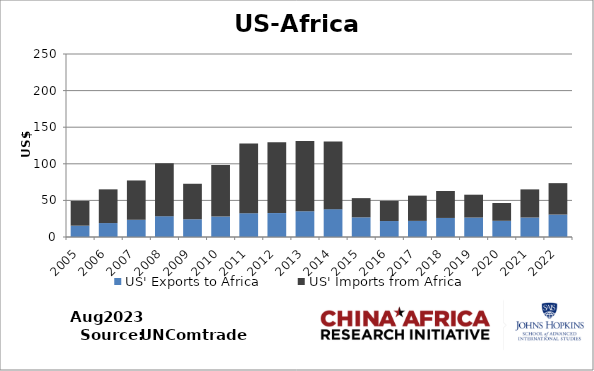
| Category | US' Exports to Africa | US' Imports from Africa |
|---|---|---|
| 2005.0 | 15.479 | 33.751 |
| 2006.0 | 19.04 | 46.053 |
| 2007.0 | 23.519 | 53.728 |
| 2008.0 | 28.426 | 72.309 |
| 2009.0 | 24.239 | 48.486 |
| 2010.0 | 27.965 | 70.324 |
| 2011.0 | 32.502 | 95.374 |
| 2012.0 | 32.697 | 96.877 |
| 2013.0 | 35.219 | 96.079 |
| 2014.0 | 38.04 | 92.434 |
| 2015.0 | 26.843 | 26.254 |
| 2016.0 | 21.812 | 27.543 |
| 2017.0 | 22.009 | 34.507 |
| 2018.0 | 26.03 | 36.83 |
| 2019.0 | 26.566 | 31.214 |
| 2020.0 | 22.122 | 24.29 |
| 2021.0 | 26.626 | 38.432 |
| 2022.0 | 30.657 | 42.916 |